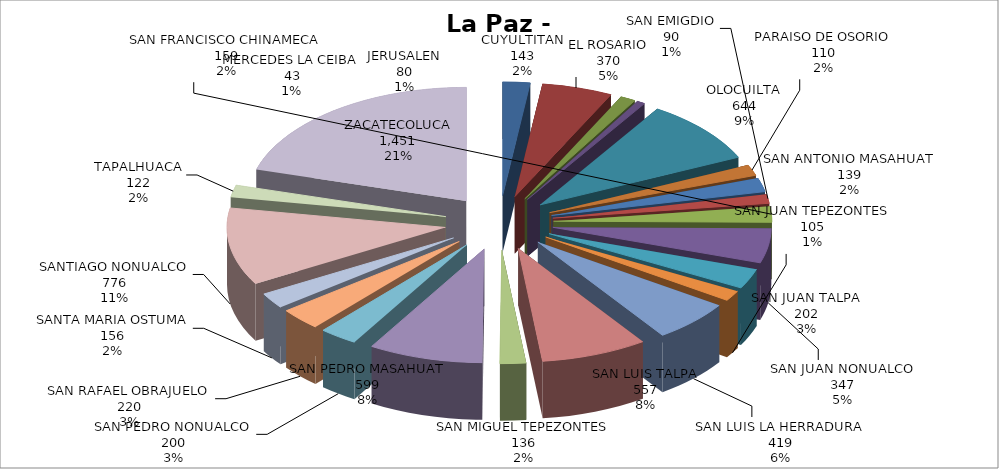
| Category | Series 0 |
|---|---|
| CUYULTITAN | 143 |
| EL ROSARIO | 370 |
| JERUSALEN | 80 |
| MERCEDES LA CEIBA | 43 |
| OLOCUILTA | 644 |
| PARAISO DE OSORIO | 110 |
| SAN ANTONIO MASAHUAT | 139 |
| SAN EMIGDIO | 90 |
| SAN FRANCISCO CHINAMECA | 159 |
| SAN JUAN NONUALCO | 347 |
| SAN JUAN TALPA | 202 |
| SAN JUAN TEPEZONTES | 105 |
| SAN LUIS LA HERRADURA | 419 |
| SAN LUIS TALPA | 557 |
| SAN MIGUEL TEPEZONTES | 136 |
| SAN PEDRO MASAHUAT | 599 |
| SAN PEDRO NONUALCO | 200 |
| SAN RAFAEL OBRAJUELO | 220 |
| SANTA MARIA OSTUMA | 156 |
| SANTIAGO NONUALCO | 776 |
| TAPALHUACA | 122 |
| ZACATECOLUCA | 1451 |